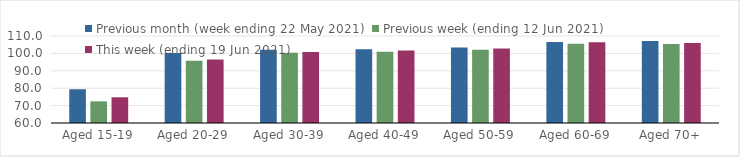
| Category | Previous month (week ending 22 May 2021) | Previous week (ending 12 Jun 2021) | This week (ending 19 Jun 2021) |
|---|---|---|---|
| Aged 15-19 | 79.4 | 72.46 | 74.77 |
| Aged 20-29 | 100.21 | 95.75 | 96.47 |
| Aged 30-39 | 102.12 | 100.35 | 100.86 |
| Aged 40-49 | 102.33 | 100.98 | 101.62 |
| Aged 50-59 | 103.38 | 102.08 | 102.82 |
| Aged 60-69 | 106.55 | 105.6 | 106.42 |
| Aged 70+ | 107.1 | 105.46 | 105.99 |